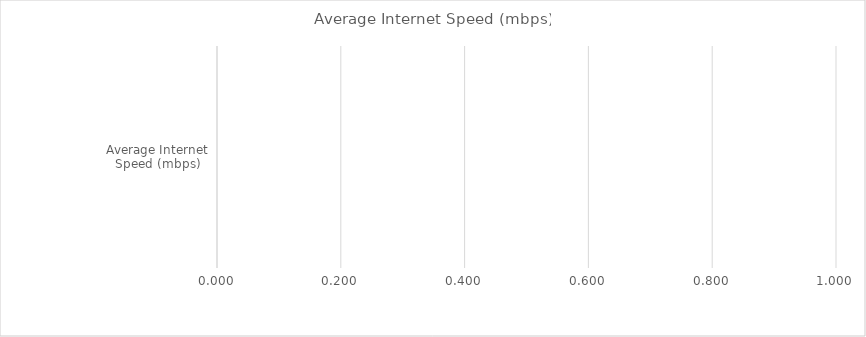
| Category | Benchmark | Title IV-A Identified Schools |
|---|---|---|
| Average Internet Speed (mbps) | 0 | 0 |